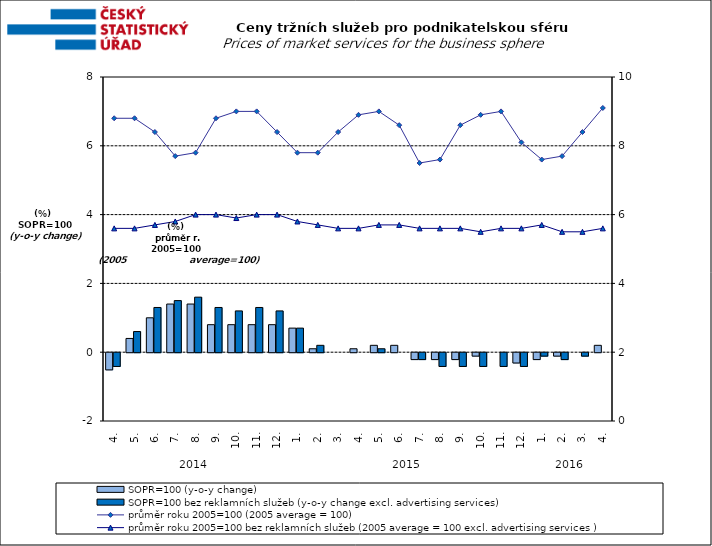
| Category | SOPR=100 (y-o-y change)   | SOPR=100 bez reklamních služeb (y-o-y change excl. advertising services)   |
|---|---|---|
| 0 | -0.5 | -0.4 |
| 1 | 0.4 | 0.6 |
| 2 | 1 | 1.3 |
| 3 | 1.4 | 1.5 |
| 4 | 1.4 | 1.6 |
| 5 | 0.8 | 1.3 |
| 6 | 0.8 | 1.2 |
| 7 | 0.8 | 1.3 |
| 8 | 0.8 | 1.2 |
| 9 | 0.7 | 0.7 |
| 10 | 0.1 | 0.2 |
| 11 | 0 | 0 |
| 12 | 0.1 | 0 |
| 13 | 0.2 | 0.1 |
| 14 | 0.2 | 0 |
| 15 | -0.2 | -0.2 |
| 16 | -0.2 | -0.4 |
| 17 | -0.2 | -0.4 |
| 18 | -0.1 | -0.4 |
| 19 | 0 | -0.4 |
| 20 | -0.3 | -0.4 |
| 21 | -0.2 | -0.1 |
| 22 | -0.1 | -0.2 |
| 23 | 0 | -0.1 |
| 24 | 0.2 | 0 |